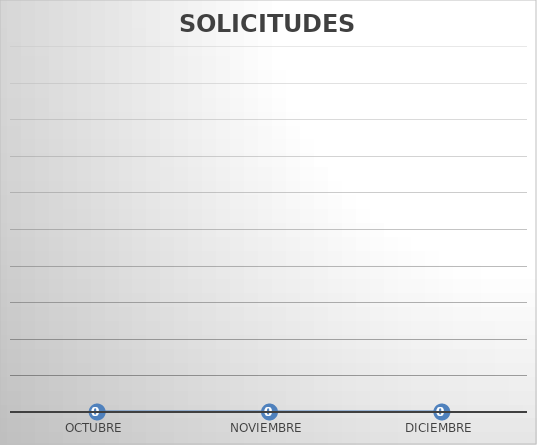
| Category | SOLICITUDES NEGADAS |
|---|---|
| OCTUBRE | 0 |
| NOVIEMBRE | 0 |
| DICIEMBRE | 0 |